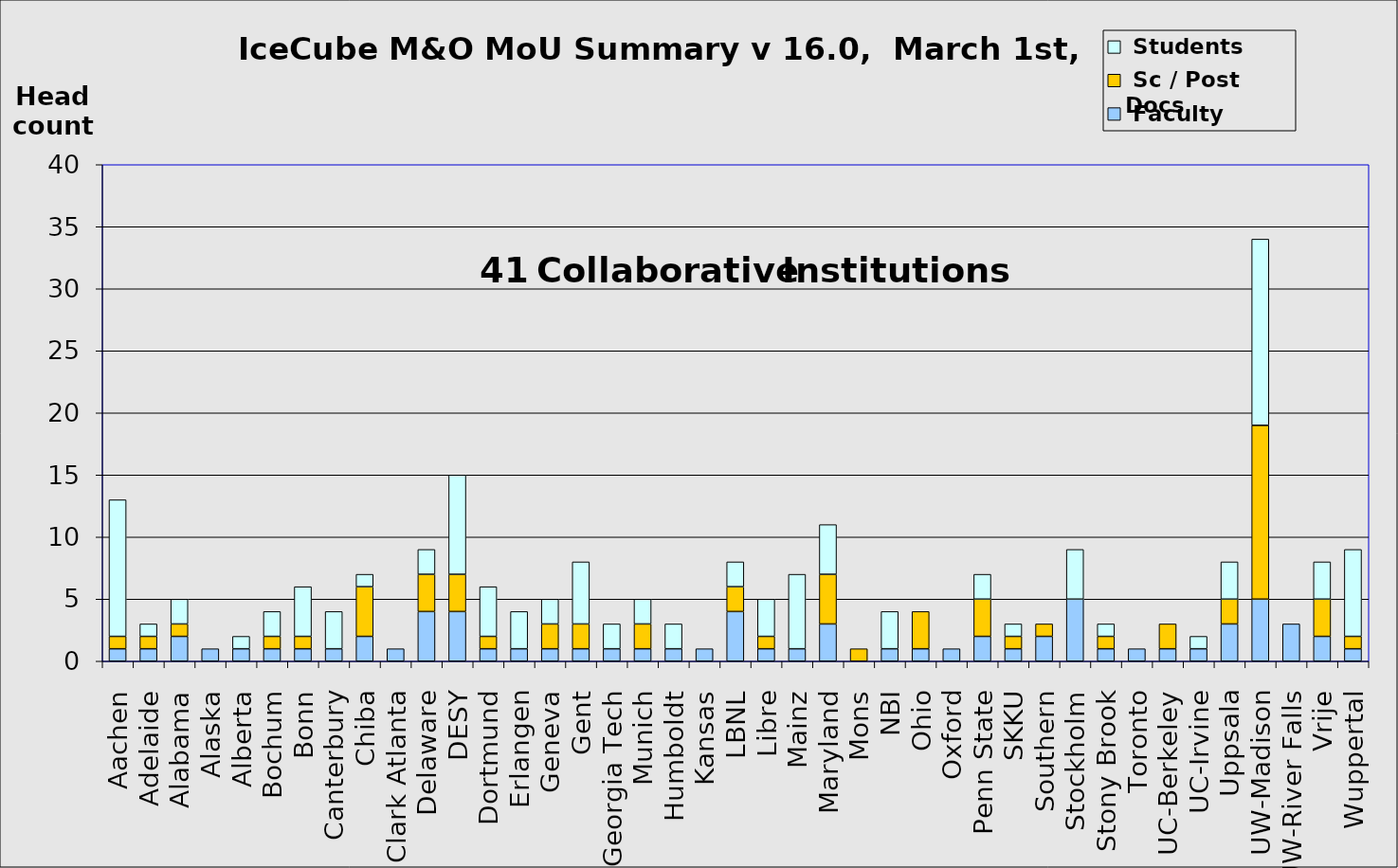
| Category |  Faculty |  Sc / Post Docs |  Students |
|---|---|---|---|
| Aachen | 1 | 1 | 11 |
| Adelaide | 1 | 1 | 1 |
| Alabama | 2 | 1 | 2 |
| Alaska | 1 | 0 | 0 |
| Alberta | 1 | 0 | 1 |
| Bochum | 1 | 1 | 2 |
| Bonn | 1 | 1 | 4 |
| Canterbury | 1 | 0 | 3 |
| Chiba | 2 | 4 | 1 |
| Clark Atlanta | 1 | 0 | 0 |
| Delaware | 4 | 3 | 2 |
| DESY | 4 | 3 | 8 |
| Dortmund | 1 | 1 | 4 |
| Erlangen | 1 | 0 | 3 |
| Geneva | 1 | 2 | 2 |
| Gent | 1 | 2 | 5 |
| Georgia Tech | 1 | 0 | 2 |
| Munich | 1 | 2 | 2 |
| Humboldt | 1 | 0 | 2 |
| Kansas | 1 | 0 | 0 |
| LBNL | 4 | 2 | 2 |
| Libre | 1 | 1 | 3 |
| Mainz | 1 | 0 | 6 |
| Maryland | 3 | 4 | 4 |
| Mons | 0 | 1 | 0 |
| NBI | 1 | 0 | 3 |
| Ohio | 1 | 3 | 0 |
| Oxford | 1 | 0 | 0 |
| Penn State | 2 | 3 | 2 |
| SKKU | 1 | 1 | 1 |
| Southern | 2 | 1 | 0 |
| Stockholm | 5 | 0 | 4 |
| Stony Brook | 1 | 1 | 1 |
| Toronto | 1 | 0 | 0 |
| UC-Berkeley | 1 | 2 | 0 |
| UC-Irvine | 1 | 0 | 1 |
| Uppsala | 3 | 2 | 3 |
| UW-Madison | 5 | 14 | 15 |
| UW-River Falls | 3 | 0 | 0 |
| Vrije | 2 | 3 | 3 |
| Wuppertal | 1 | 1 | 7 |